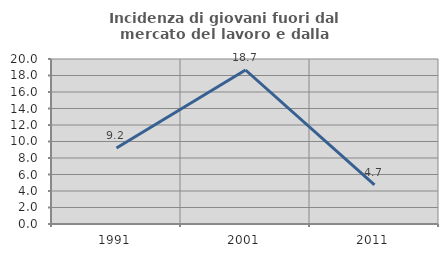
| Category | Incidenza di giovani fuori dal mercato del lavoro e dalla formazione  |
|---|---|
| 1991.0 | 9.217 |
| 2001.0 | 18.667 |
| 2011.0 | 4.73 |